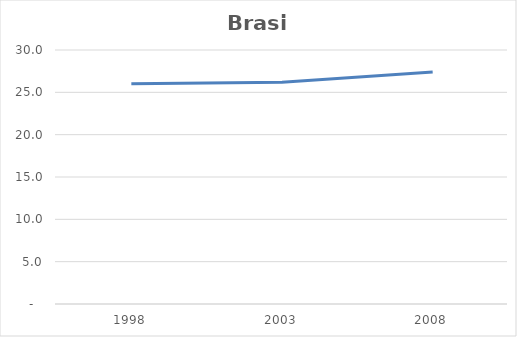
| Category | Brasil |
|---|---|
| 1998.0 | 26 |
| 2003.0 | 26.2 |
| 2008.0 | 27.4 |